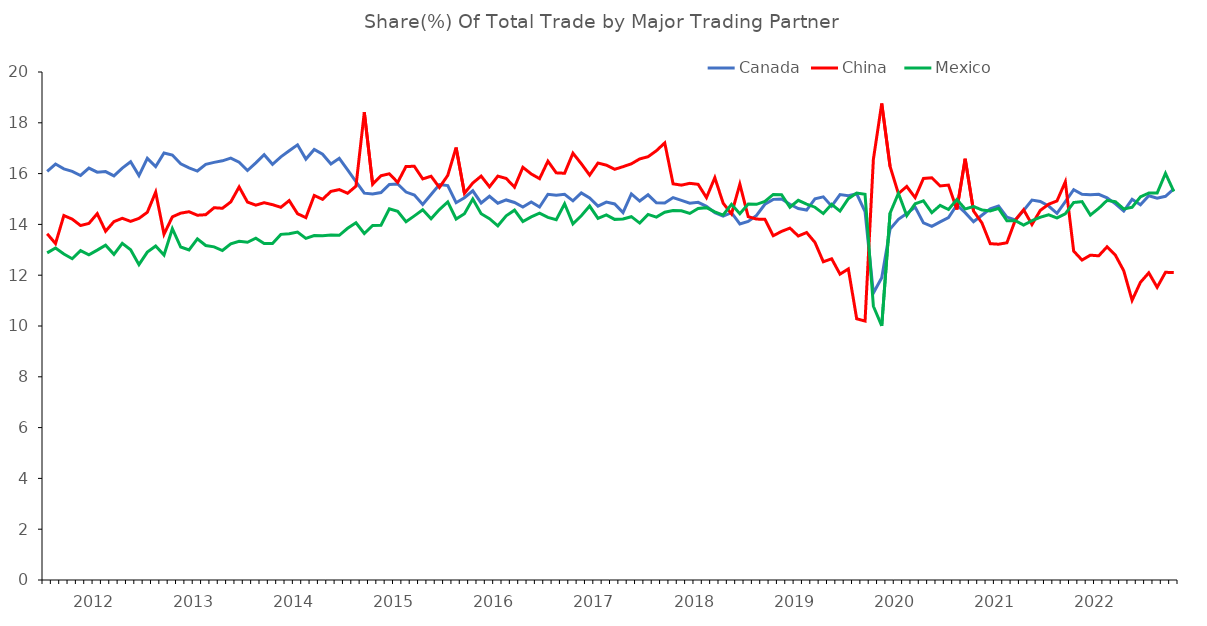
| Category | Canada | China  | Mexico |
|---|---|---|---|
| nan | 16.091 | 13.631 | 12.878 |
| nan | 16.377 | 13.245 | 13.072 |
| nan | 16.187 | 14.349 | 12.832 |
| nan | 16.088 | 14.207 | 12.649 |
| nan | 15.926 | 13.956 | 12.966 |
| nan | 16.217 | 14.038 | 12.805 |
| 2012.0 | 16.055 | 14.423 | 12.986 |
| nan | 16.08 | 13.731 | 13.178 |
| nan | 15.912 | 14.109 | 12.82 |
| nan | 16.219 | 14.241 | 13.254 |
| nan | 16.466 | 14.119 | 13.005 |
| nan | 15.922 | 14.237 | 12.415 |
| nan | 16.598 | 14.477 | 12.91 |
| nan | 16.276 | 15.269 | 13.147 |
| nan | 16.812 | 13.614 | 12.795 |
| nan | 16.73 | 14.297 | 13.831 |
| nan | 16.384 | 14.443 | 13.109 |
| nan | 16.223 | 14.499 | 12.996 |
| 2013.0 | 16.101 | 14.361 | 13.428 |
| nan | 16.362 | 14.382 | 13.168 |
| nan | 16.443 | 14.657 | 13.115 |
| nan | 16.503 | 14.635 | 12.972 |
| nan | 16.613 | 14.885 | 13.231 |
| nan | 16.451 | 15.475 | 13.333 |
| nan | 16.121 | 14.879 | 13.298 |
| nan | 16.424 | 14.758 | 13.456 |
| nan | 16.743 | 14.854 | 13.243 |
| nan | 16.366 | 14.777 | 13.247 |
| nan | 16.659 | 14.673 | 13.607 |
| nan | 16.901 | 14.937 | 13.635 |
| 2014.0 | 17.134 | 14.421 | 13.701 |
| nan | 16.572 | 14.266 | 13.451 |
| nan | 16.95 | 15.139 | 13.561 |
| nan | 16.764 | 14.987 | 13.557 |
| nan | 16.375 | 15.299 | 13.579 |
| nan | 16.604 | 15.371 | 13.57 |
| nan | 16.15 | 15.226 | 13.848 |
| nan | 15.686 | 15.504 | 14.063 |
| nan | 15.23 | 18.414 | 13.643 |
| nan | 15.196 | 15.581 | 13.959 |
| nan | 15.255 | 15.916 | 13.97 |
| nan | 15.576 | 15.993 | 14.612 |
| 2015.0 | 15.59 | 15.654 | 14.511 |
| nan | 15.273 | 16.284 | 14.102 |
| nan | 15.157 | 16.285 | 14.335 |
| nan | 14.787 | 15.791 | 14.578 |
| nan | 15.179 | 15.896 | 14.226 |
| nan | 15.569 | 15.454 | 14.585 |
| nan | 15.53 | 15.93 | 14.883 |
| nan | 14.855 | 17.025 | 14.213 |
| nan | 15.052 | 15.223 | 14.42 |
| nan | 15.322 | 15.63 | 14.996 |
| nan | 14.844 | 15.901 | 14.421 |
| nan | 15.108 | 15.48 | 14.224 |
| 2016.0 | 14.835 | 15.9 | 13.946 |
| nan | 14.963 | 15.809 | 14.338 |
| nan | 14.863 | 15.466 | 14.561 |
| nan | 14.686 | 16.248 | 14.114 |
| nan | 14.886 | 15.986 | 14.297 |
| nan | 14.684 | 15.8 | 14.443 |
| nan | 15.186 | 16.489 | 14.274 |
| nan | 15.144 | 16.03 | 14.184 |
| nan | 15.187 | 16.014 | 14.815 |
| nan | 14.927 | 16.804 | 14.023 |
| nan | 15.241 | 16.389 | 14.337 |
| nan | 15.041 | 15.941 | 14.722 |
| 2017.0 | 14.718 | 16.416 | 14.239 |
| nan | 14.878 | 16.333 | 14.377 |
| nan | 14.804 | 16.169 | 14.198 |
| nan | 14.468 | 16.273 | 14.21 |
| nan | 15.202 | 16.385 | 14.304 |
| nan | 14.919 | 16.578 | 14.052 |
| nan | 15.165 | 16.665 | 14.394 |
| nan | 14.849 | 16.901 | 14.287 |
| nan | 14.839 | 17.209 | 14.479 |
| nan | 15.057 | 15.597 | 14.546 |
| nan | 14.947 | 15.546 | 14.538 |
| nan | 14.835 | 15.617 | 14.432 |
| 2018.0 | 14.869 | 15.578 | 14.631 |
| nan | 14.712 | 15.054 | 14.66 |
| nan | 14.464 | 15.839 | 14.492 |
| nan | 14.327 | 14.834 | 14.368 |
| nan | 14.46 | 14.412 | 14.789 |
| nan | 14.018 | 15.583 | 14.422 |
| nan | 14.12 | 14.305 | 14.8 |
| nan | 14.352 | 14.209 | 14.791 |
| nan | 14.793 | 14.202 | 14.902 |
| nan | 14.986 | 13.553 | 15.18 |
| nan | 15.004 | 13.725 | 15.166 |
| nan | 14.794 | 13.854 | 14.675 |
| 2019.0 | 14.624 | 13.543 | 14.949 |
| nan | 14.566 | 13.68 | 14.802 |
| nan | 15.008 | 13.291 | 14.677 |
| nan | 15.086 | 12.529 | 14.426 |
| nan | 14.716 | 12.646 | 14.79 |
| nan | 15.172 | 12.041 | 14.525 |
| nan | 15.126 | 12.246 | 15.012 |
| nan | 15.203 | 10.284 | 15.233 |
| nan | 14.501 | 10.195 | 15.185 |
| nan | 11.296 | 16.562 | 10.778 |
| nan | 11.899 | 18.761 | 10.003 |
| nan | 13.815 | 16.28 | 14.443 |
| 2020.0 | 14.199 | 15.209 | 15.223 |
| nan | 14.426 | 15.493 | 14.345 |
| nan | 14.684 | 15.056 | 14.811 |
| nan | 14.059 | 15.809 | 14.928 |
| nan | 13.923 | 15.837 | 14.462 |
| nan | 14.102 | 15.511 | 14.75 |
| nan | 14.269 | 15.549 | 14.587 |
| nan | 14.764 | 14.583 | 14.978 |
| nan | 14.461 | 16.582 | 14.606 |
| nan | 14.106 | 14.527 | 14.706 |
| nan | 14.359 | 14.062 | 14.569 |
| nan | 14.61 | 13.241 | 14.529 |
| 2021.0 | 14.724 | 13.22 | 14.629 |
| nan | 14.288 | 13.277 | 14.143 |
| nan | 14.172 | 14.165 | 14.149 |
| nan | 14.549 | 14.577 | 13.973 |
| nan | 14.955 | 13.996 | 14.147 |
| nan | 14.903 | 14.551 | 14.282 |
| nan | 14.723 | 14.795 | 14.379 |
| nan | 14.436 | 14.923 | 14.253 |
| nan | 14.901 | 15.677 | 14.42 |
| nan | 15.366 | 12.948 | 14.861 |
| nan | 15.185 | 12.596 | 14.897 |
| nan | 15.164 | 12.789 | 14.368 |
| 2022.0 | 15.184 | 12.763 | 14.631 |
| nan | 15.045 | 13.118 | 14.945 |
| nan | 14.807 | 12.785 | 14.893 |
| nan | 14.528 | 12.175 | 14.608 |
| nan | 14.987 | 11.012 | 14.673 |
| nan | 14.772 | 11.72 | 15.085 |
| nan | 15.126 | 12.094 | 15.233 |
| nan | 15.031 | 11.523 | 15.232 |
| nan | 15.107 | 12.115 | 16.01 |
| nan | 15.397 | 12.102 | 15.296 |